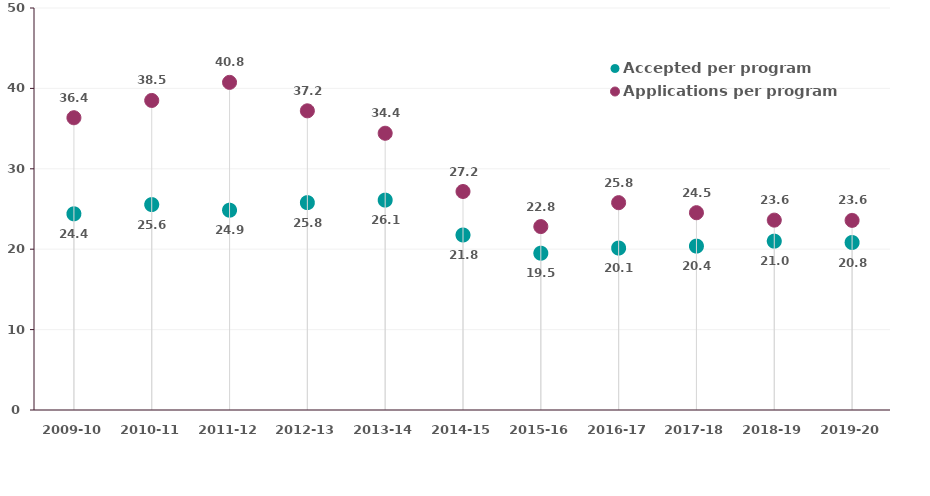
| Category | Accepted per program | Applications per program |
|---|---|---|
| 2009-10 | 24.4 | 36.35 |
| 2010-11 | 25.55 | 38.5 |
| 2011-12 | 24.85 | 40.75 |
| 2012-13 | 25.789 | 37.211 |
| 2013-14 | 26.105 | 34.421 |
| 2014-15 | 21.765 | 27.176 |
| 2015-16 | 19.5 | 22.812 |
| 2016-17 | 20.143 | 25.786 |
| 2017-18 | 20.385 | 24.538 |
| 2018-19 | 21 | 23.615 |
| 2019-20 | 20.833 | 23.583 |